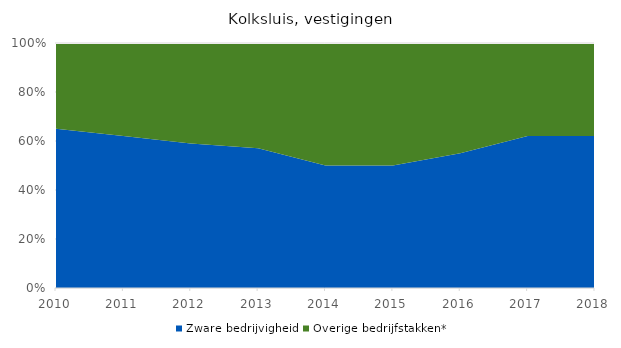
| Category | Zware bedrijvigheid | Overige bedrijfstakken* |
|---|---|---|
| 2010 | 0.65 | 0.35 |
| 2011 | 0.62 | 0.38 |
| 2012 | 0.59 | 0.41 |
| 2013 | 0.57 | 0.43 |
| 2014 | 0.5 | 0.5 |
| 2015 | 0.5 | 0.5 |
| 2016 | 0.55 | 0.45 |
| 2017 | 0.62 | 0.38 |
| 2018 | 0.62 | 0.38 |